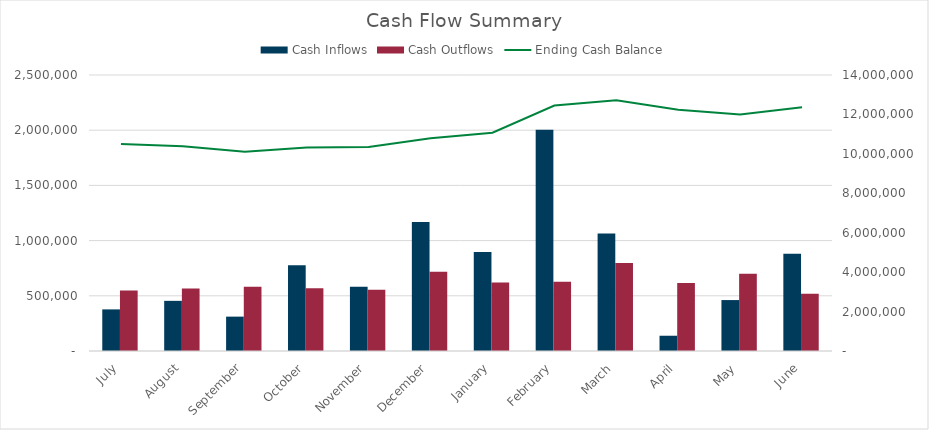
| Category | Cash Inflows | Cash Outflows |
|---|---|---|
| July | 376908.289 | 548346.496 |
| August | 454308.58 | 566642.603 |
| September | 311274.895 | 581435.847 |
| October | 776878.793 | 567688.703 |
| November | 581259.48 | 553678.261 |
| December | 1167587.772 | 718594.371 |
| January | 895729.503 | 619968.358 |
| February | 2004952.914 | 627039.909 |
| March | 1063609.922 | 797890.33 |
| April | 138249.618 | 615178.377 |
| May | 461376.687 | 699376.724 |
| June | 880204.546 | 517643.021 |